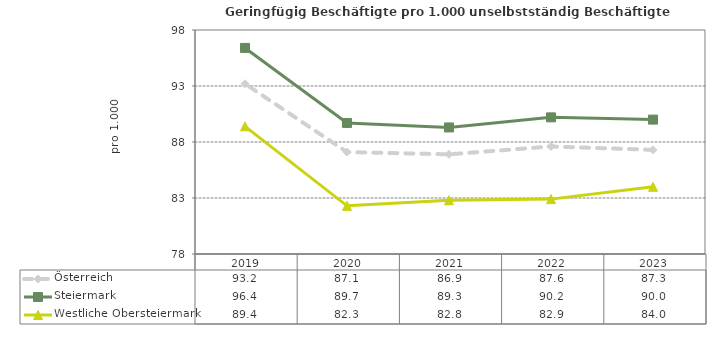
| Category | Österreich | Steiermark | Westliche Obersteiermark |
|---|---|---|---|
| 2023.0 | 87.3 | 90 | 84 |
| 2022.0 | 87.6 | 90.2 | 82.9 |
| 2021.0 | 86.9 | 89.3 | 82.8 |
| 2020.0 | 87.1 | 89.7 | 82.3 |
| 2019.0 | 93.2 | 96.4 | 89.4 |